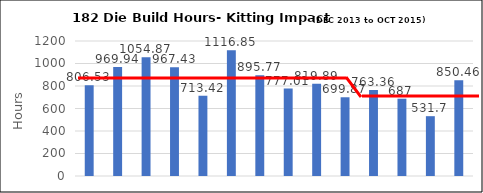
| Category | Series 0 |
|---|---|
| 8270-03 | 806.53 |
| 8270-05 | 969.94 |
| 8361-01 | 1054.87 |
| 8361-02 | 967.43 |
| 8361-03 | 713.42 |
| 8361-04 | 1116.85 |
| 8433-01 | 895.77 |
| 8439-01 | 777.01 |
| 8439-02 | 819.89 |
| 8439-03 | 699.87 |
| 8440-01 | 763.36 |
| 8460-01 | 687 |
| 8463-01 | 531.7 |
| 8502-01 | 850.46 |